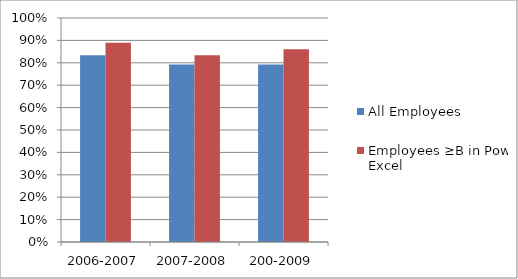
| Category | All Employees | Employees ≥B in Power Excel |
|---|---|---|
| 2006-2007 | 0.834 | 0.889 |
| 2007-2008 | 0.792 | 0.834 |
| 200-2009 | 0.793 | 0.86 |